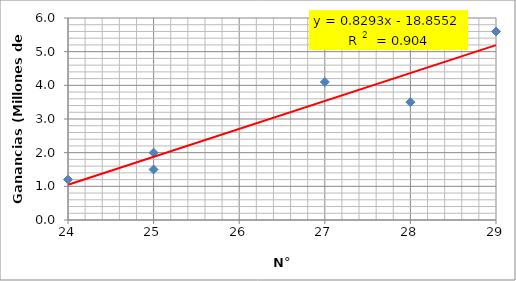
| Category | N° Vendedores |
|---|---|
| 24.0 | 1.2 |
| 25.0 | 1.5 |
| 25.0 | 2 |
| 28.0 | 3.5 |
| 27.0 | 4.1 |
| 29.0 | 5.6 |